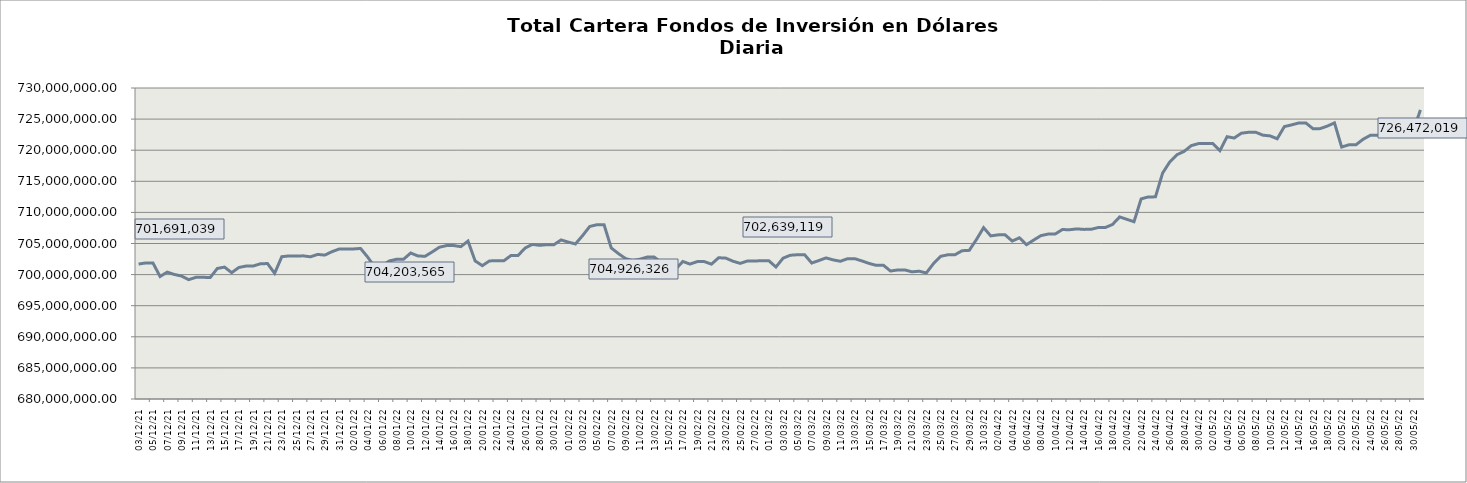
| Category | Cartera |
|---|---|
| 2021-12-03 | 701691039.1 |
| 2021-12-04 | 701875097.71 |
| 2021-12-05 | 701881606.36 |
| 2021-12-06 | 699695774.86 |
| 2021-12-07 | 700398880.65 |
| 2021-12-08 | 700021554.66 |
| 2021-12-09 | 699768676.48 |
| 2021-12-10 | 699187427.23 |
| 2021-12-11 | 699561720.51 |
| 2021-12-12 | 699568092.06 |
| 2021-12-13 | 699523398.05 |
| 2021-12-14 | 700989575.34 |
| 2021-12-15 | 701206405.54 |
| 2021-12-16 | 700309800.35 |
| 2021-12-17 | 701141525.19 |
| 2021-12-18 | 701370725.28 |
| 2021-12-19 | 701377033.04 |
| 2021-12-20 | 701734216.01 |
| 2021-12-21 | 701777256.36 |
| 2021-12-22 | 700210619.9 |
| 2021-12-23 | 702878884.19 |
| 2021-12-24 | 703002370.03 |
| 2021-12-25 | 703005249.56 |
| 2021-12-26 | 703011538.44 |
| 2021-12-27 | 702860507.44 |
| 2021-12-28 | 703250114.85 |
| 2021-12-29 | 703134530.98 |
| 2021-12-30 | 703682643.45 |
| 2021-12-31 | 704109189.26 |
| 2022-01-01 | 704115803 |
| 2022-01-02 | 704122794.99 |
| 2022-01-03 | 704203565 |
| 2022-01-04 | 702804270.4 |
| 2022-01-05 | 701158822.94 |
| 2022-01-06 | 701428810.3 |
| 2022-01-07 | 702187173.77 |
| 2022-01-08 | 702461404.77 |
| 2022-01-09 | 702468320.11 |
| 2022-01-10 | 703470522.57 |
| 2022-01-11 | 703001730.9 |
| 2022-01-12 | 702939720.87 |
| 2022-01-13 | 703643524.5 |
| 2022-01-14 | 704399231.42 |
| 2022-01-15 | 704663690.96 |
| 2022-01-16 | 704670203.11 |
| 2022-01-17 | 704494387.09 |
| 2022-01-18 | 705388125.64 |
| 2022-01-19 | 702195926.45 |
| 2022-01-20 | 701439691.35 |
| 2022-01-21 | 702204893.51 |
| 2022-01-22 | 702210674.96 |
| 2022-01-23 | 702217653.91 |
| 2022-01-24 | 703067467.88 |
| 2022-01-25 | 703086333.22 |
| 2022-01-26 | 704296288.5 |
| 2022-01-27 | 704849694.83 |
| 2022-01-28 | 704707998.68 |
| 2022-01-29 | 704805117.53 |
| 2022-01-30 | 704812873.23 |
| 2022-01-31 | 705572171.18 |
| 2022-02-01 | 705228416.05 |
| 2022-02-02 | 704926325.55 |
| 2022-02-03 | 706265158.35 |
| 2022-02-04 | 707738819.43 |
| 2022-02-05 | 708016816.47 |
| 2022-02-06 | 708023595.94 |
| 2022-02-07 | 704292983.3 |
| 2022-02-08 | 703379249.38 |
| 2022-02-09 | 702581632.76 |
| 2022-02-10 | 702256275.96 |
| 2022-02-11 | 702475393.54 |
| 2022-02-12 | 702809520.02 |
| 2022-02-13 | 702817208.65 |
| 2022-02-14 | 701949772.6 |
| 2022-02-15 | 701143262.06 |
| 2022-02-16 | 700871498.2 |
| 2022-02-17 | 702110362.87 |
| 2022-02-18 | 701690089.22 |
| 2022-02-19 | 702085614.28 |
| 2022-02-20 | 702090262.59 |
| 2022-02-21 | 701678369.88 |
| 2022-02-22 | 702711976.42 |
| 2022-02-23 | 702647390.56 |
| 2022-02-24 | 702156467.03 |
| 2022-02-25 | 701805361.94 |
| 2022-02-26 | 702173159.51 |
| 2022-02-27 | 702181411.39 |
| 2022-02-28 | 702233733.26 |
| 2022-03-01 | 702241783.68 |
| 2022-03-02 | 701220117.82 |
| 2022-03-03 | 702639118.93 |
| 2022-03-04 | 703111299.93 |
| 2022-03-05 | 703192760.44 |
| 2022-03-06 | 703202423.1 |
| 2022-03-07 | 701861096.04 |
| 2022-03-08 | 702260964.06 |
| 2022-03-09 | 702682222.38 |
| 2022-03-10 | 702361837.41 |
| 2022-03-11 | 702144548.74 |
| 2022-03-12 | 702552738.5 |
| 2022-03-13 | 702561316.33 |
| 2022-03-14 | 702200565.38 |
| 2022-03-15 | 701802445.84 |
| 2022-03-16 | 701487806.49 |
| 2022-03-17 | 701512528.19 |
| 2022-03-18 | 700575721.21 |
| 2022-03-19 | 700744184.85 |
| 2022-03-20 | 700754280.42 |
| 2022-03-21 | 700442422.68 |
| 2022-03-22 | 700548140.16 |
| 2022-03-23 | 700264349.17 |
| 2022-03-24 | 701759797.84 |
| 2022-03-25 | 702935811.86 |
| 2022-03-26 | 703182573.11 |
| 2022-03-27 | 703192368.46 |
| 2022-03-28 | 703839941.7 |
| 2022-03-29 | 703898991.69 |
| 2022-03-30 | 705633862.45 |
| 2022-03-31 | 707547141.75 |
| 2022-04-01 | 706222648.67 |
| 2022-04-02 | 706385747.57 |
| 2022-04-03 | 706395390.47 |
| 2022-04-04 | 705391443.98 |
| 2022-04-05 | 705918227.55 |
| 2022-04-06 | 704809815.67 |
| 2022-04-07 | 705557657.34 |
| 2022-04-08 | 706262035.26 |
| 2022-04-09 | 706514701.75 |
| 2022-04-10 | 706524433.41 |
| 2022-04-11 | 707243701.08 |
| 2022-04-12 | 707211472.55 |
| 2022-04-13 | 707349977.49 |
| 2022-04-14 | 707268648.06 |
| 2022-04-15 | 707279183.63 |
| 2022-04-16 | 707562838.04 |
| 2022-04-17 | 707572622.08 |
| 2022-04-18 | 708056943.57 |
| 2022-04-19 | 709272652.64 |
| 2022-04-20 | 708892653.51 |
| 2022-04-21 | 708499590.38 |
| 2022-04-22 | 712172507.93 |
| 2022-04-23 | 712488172.3 |
| 2022-04-24 | 712498151.45 |
| 2022-04-25 | 716324679.05 |
| 2022-04-26 | 718120010.5 |
| 2022-04-27 | 719269911.04 |
| 2022-04-28 | 719808415.88 |
| 2022-04-29 | 720734976.25 |
| 2022-04-30 | 721059263.84 |
| 2022-05-01 | 721069525.18 |
| 2022-05-02 | 721079924.38 |
| 2022-05-03 | 719925889.77 |
| 2022-05-04 | 722170981.44 |
| 2022-05-05 | 721958012.14 |
| 2022-05-06 | 722734750.54 |
| 2022-05-07 | 722880640.79 |
| 2022-05-08 | 722889862.98 |
| 2022-05-09 | 722416429.18 |
| 2022-05-10 | 722299663.93 |
| 2022-05-11 | 721839533.28 |
| 2022-05-12 | 723795320.82 |
| 2022-05-13 | 724065474.42 |
| 2022-05-14 | 724376645.5 |
| 2022-05-15 | 724386536.95 |
| 2022-05-16 | 723451979.96 |
| 2022-05-17 | 723469876.65 |
| 2022-05-18 | 723875582.31 |
| 2022-05-19 | 724392443.21 |
| 2022-05-20 | 720505285.92 |
| 2022-05-21 | 720863969.79 |
| 2022-05-22 | 720873950.88 |
| 2022-05-23 | 721761393.77 |
| 2022-05-24 | 722390106.98 |
| 2022-05-25 | 722392271.01 |
| 2022-05-26 | 722816243.79 |
| 2022-05-27 | 723119390.3 |
| 2022-05-28 | 723330316.64 |
| 2022-05-29 | 723340720.02 |
| 2022-05-30 | 723123203.59 |
| 2022-05-31 | 726472018.97 |